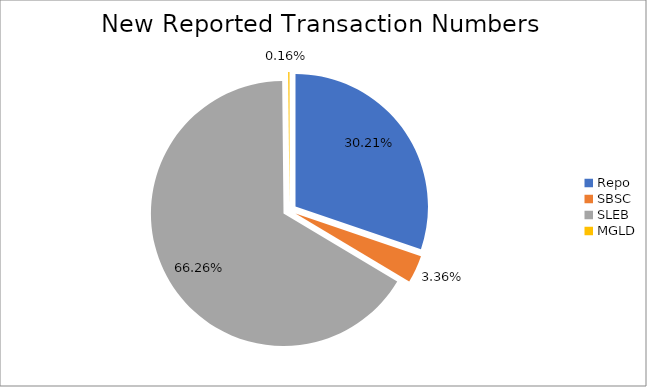
| Category | Series 0 |
|---|---|
| Repo | 410792 |
| SBSC | 45729 |
| SLEB | 900910 |
| MGLD | 2171 |